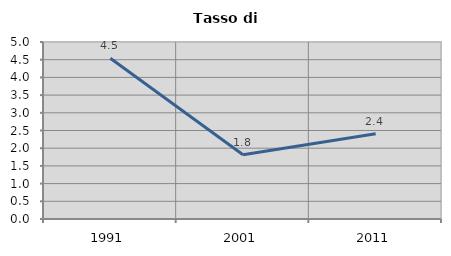
| Category | Tasso di disoccupazione   |
|---|---|
| 1991.0 | 4.542 |
| 2001.0 | 1.814 |
| 2011.0 | 2.407 |